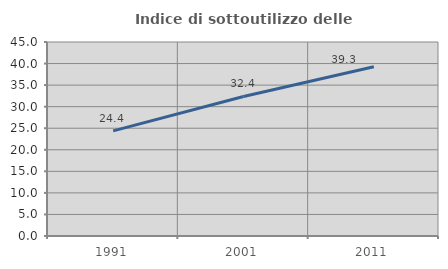
| Category | Indice di sottoutilizzo delle abitazioni  |
|---|---|
| 1991.0 | 24.375 |
| 2001.0 | 32.367 |
| 2011.0 | 39.256 |